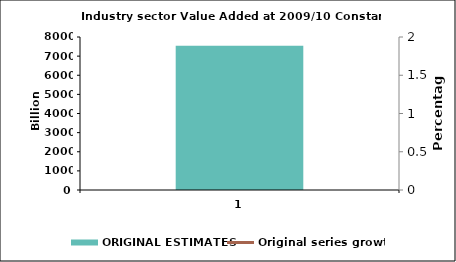
| Category | ORIGINAL ESTIMATES |
|---|---|
| 0 | 7537.203 |